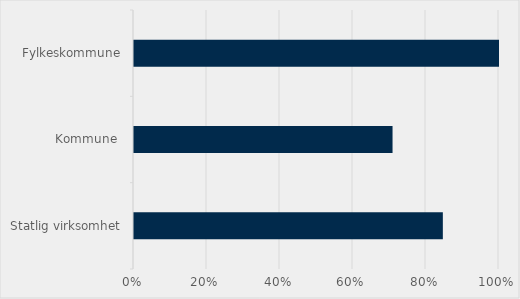
| Category | Prosent |
|---|---|
| Statlig virksomhet | 0.846 |
| Kommune  | 0.708 |
| Fylkeskommune | 1 |